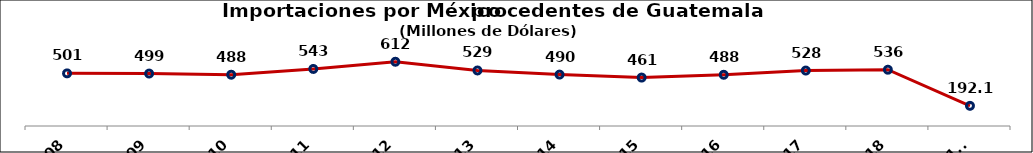
| Category | Series 0 |
|---|---|
| 2008 | 501.219 |
| 2009 | 499.464 |
| 2010 | 488.374 |
| 2011 | 543.323 |
| 2012 | 611.724 |
| 2013 | 528.828 |
| 2014 | 489.549 |
| 2015 | 461.194 |
| 2016 | 487.807 |
| 2017 | 528 |
| 2018 | 536 |
| 2019 Enero-Mayo | 192.1 |